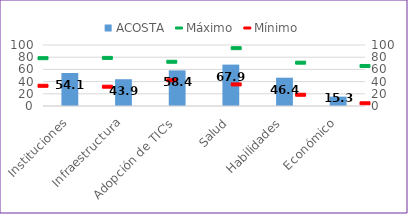
| Category | ACOSTA |
|---|---|
| Instituciones | 54.14 |
| Infraestructura | 43.882 |
| Adopción de TIC's | 58.388 |
| Salud | 67.873 |
| Habilidades | 46.393 |
| Económico | 15.339 |